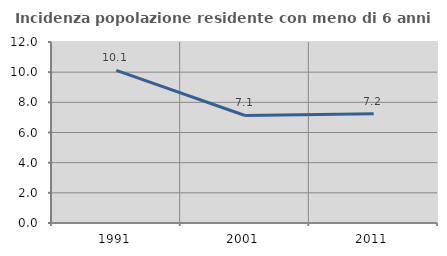
| Category | Incidenza popolazione residente con meno di 6 anni |
|---|---|
| 1991.0 | 10.12 |
| 2001.0 | 7.128 |
| 2011.0 | 7.241 |